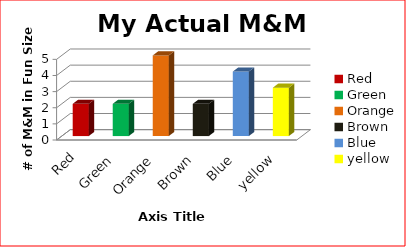
| Category | Series 0 |
|---|---|
| Red | 2 |
| Green | 2 |
| Orange | 5 |
| Brown | 2 |
| Blue | 4 |
| yellow | 3 |